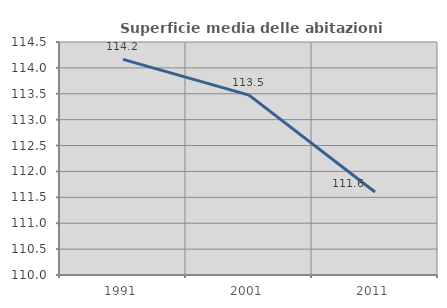
| Category | Superficie media delle abitazioni occupate |
|---|---|
| 1991.0 | 114.164 |
| 2001.0 | 113.474 |
| 2011.0 | 111.604 |